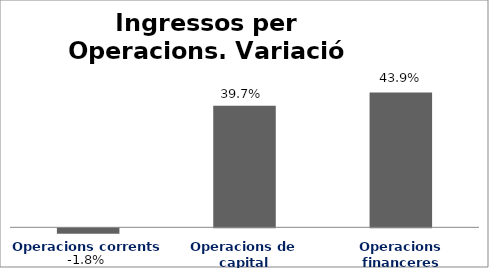
| Category | Series 0 |
|---|---|
| Operacions corrents | -0.018 |
| Operacions de capital | 0.397 |
| Operacions financeres | 0.439 |